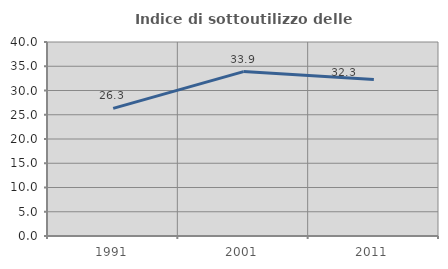
| Category | Indice di sottoutilizzo delle abitazioni  |
|---|---|
| 1991.0 | 26.321 |
| 2001.0 | 33.893 |
| 2011.0 | 32.277 |